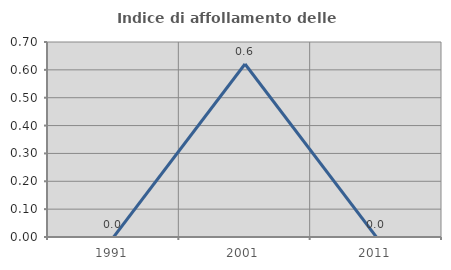
| Category | Indice di affollamento delle abitazioni  |
|---|---|
| 1991.0 | 0 |
| 2001.0 | 0.621 |
| 2011.0 | 0 |